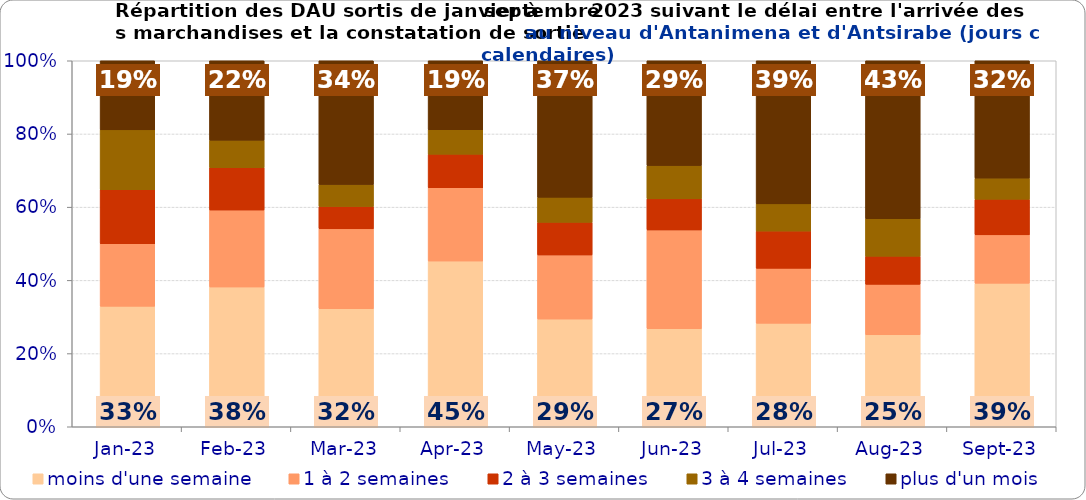
| Category | moins d'une semaine | 1 à 2 semaines | 2 à 3 semaines | 3 à 4 semaines | plus d'un mois |
|---|---|---|---|---|---|
| 2023-01-01 | 0.329 | 0.171 | 0.148 | 0.164 | 0.189 |
| 2023-02-01 | 0.382 | 0.21 | 0.116 | 0.075 | 0.217 |
| 2023-03-01 | 0.322 | 0.218 | 0.061 | 0.06 | 0.338 |
| 2023-04-01 | 0.453 | 0.2 | 0.092 | 0.067 | 0.188 |
| 2023-05-01 | 0.294 | 0.175 | 0.089 | 0.069 | 0.373 |
| 2023-06-01 | 0.268 | 0.27 | 0.085 | 0.091 | 0.286 |
| 2023-07-01 | 0.283 | 0.15 | 0.102 | 0.074 | 0.391 |
| 2023-08-01 | 0.251 | 0.138 | 0.077 | 0.102 | 0.432 |
| 2023-09-01 | 0.392 | 0.132 | 0.097 | 0.058 | 0.321 |